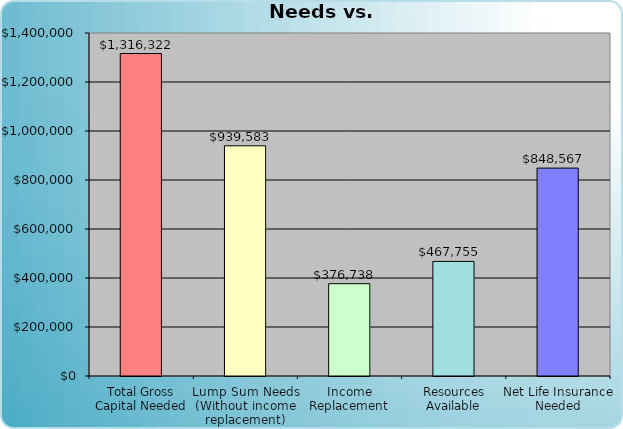
| Category | Series 0 |
|---|---|
| Total Gross Capital Needed | 1316321.574 |
| Lump Sum Needs (Without income replacement) | 939583.285 |
| Income Replacement | 376738.288 |
| Resources Available | 467755 |
| Net Life Insurance Needed | 848566.574 |